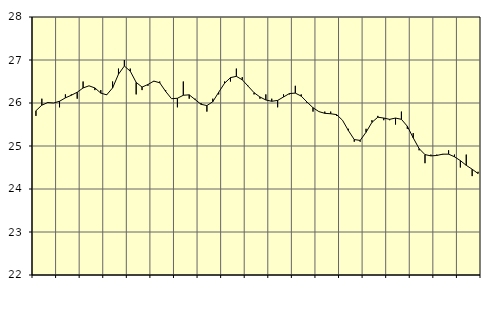
| Category | Piggar | Series 1 |
|---|---|---|
| nan | 25.7 | 25.82 |
| 1.0 | 26.1 | 25.95 |
| 1.0 | 26 | 26.01 |
| 1.0 | 26 | 26 |
| nan | 25.9 | 26.04 |
| 2.0 | 26.2 | 26.12 |
| 2.0 | 26.2 | 26.18 |
| 2.0 | 26.1 | 26.25 |
| nan | 26.5 | 26.35 |
| 3.0 | 26.4 | 26.4 |
| 3.0 | 26.3 | 26.35 |
| 3.0 | 26.3 | 26.23 |
| nan | 26.2 | 26.19 |
| 4.0 | 26.5 | 26.35 |
| 4.0 | 26.8 | 26.67 |
| 4.0 | 27 | 26.86 |
| nan | 26.8 | 26.74 |
| 5.0 | 26.2 | 26.48 |
| 5.0 | 26.3 | 26.37 |
| 5.0 | 26.4 | 26.43 |
| nan | 26.5 | 26.51 |
| 6.0 | 26.5 | 26.47 |
| 6.0 | 26.3 | 26.27 |
| 6.0 | 26.1 | 26.1 |
| nan | 25.9 | 26.11 |
| 7.0 | 26.5 | 26.18 |
| 7.0 | 26.1 | 26.19 |
| 7.0 | 26.1 | 26.08 |
| nan | 26 | 25.97 |
| 8.0 | 25.8 | 25.94 |
| 8.0 | 26.1 | 26.03 |
| 8.0 | 26.2 | 26.25 |
| nan | 26.5 | 26.46 |
| 9.0 | 26.5 | 26.59 |
| 9.0 | 26.8 | 26.62 |
| 9.0 | 26.6 | 26.54 |
| nan | 26.4 | 26.39 |
| 10.0 | 26.2 | 26.24 |
| 10.0 | 26.1 | 26.14 |
| 10.0 | 26.2 | 26.07 |
| nan | 26.1 | 26.04 |
| 11.0 | 25.9 | 26.06 |
| 11.0 | 26.2 | 26.14 |
| 11.0 | 26.2 | 26.22 |
| nan | 26.4 | 26.23 |
| 12.0 | 26.2 | 26.16 |
| 12.0 | 26 | 26.02 |
| 12.0 | 25.8 | 25.89 |
| nan | 25.8 | 25.8 |
| 13.0 | 25.8 | 25.76 |
| 13.0 | 25.8 | 25.75 |
| 13.0 | 25.7 | 25.73 |
| nan | 25.6 | 25.6 |
| 14.0 | 25.4 | 25.36 |
| 14.0 | 25.1 | 25.15 |
| 14.0 | 25.1 | 25.13 |
| nan | 25.4 | 25.32 |
| 15.0 | 25.6 | 25.55 |
| 15.0 | 25.7 | 25.67 |
| 15.0 | 25.6 | 25.65 |
| nan | 25.6 | 25.62 |
| 16.0 | 25.5 | 25.65 |
| 16.0 | 25.8 | 25.62 |
| 16.0 | 25.4 | 25.46 |
| nan | 25.3 | 25.19 |
| 17.0 | 24.9 | 24.94 |
| 17.0 | 24.6 | 24.8 |
| 17.0 | 24.8 | 24.77 |
| nan | 24.8 | 24.78 |
| 18.0 | 24.8 | 24.81 |
| 18.0 | 24.9 | 24.81 |
| 18.0 | 24.8 | 24.75 |
| nan | 24.5 | 24.66 |
| 19.0 | 24.8 | 24.55 |
| 19.0 | 24.3 | 24.46 |
| 19.0 | 24.4 | 24.36 |